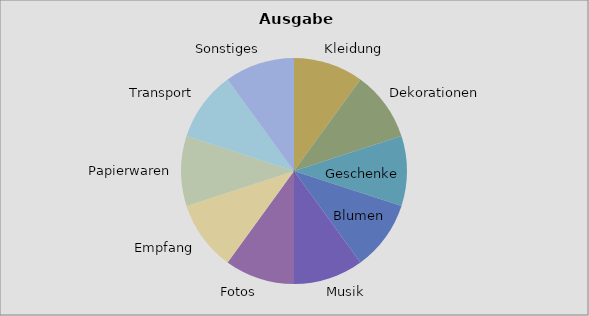
| Category | Betrag |
|---|---|
| Kleidung | 1 |
| Dekorationen | 1 |
| Geschenke | 1 |
| Blumen | 1 |
| Musik | 1 |
| Fotos | 1 |
| Empfang | 1 |
| Papierwaren | 1 |
| Transport | 1 |
| Sonstiges | 1 |